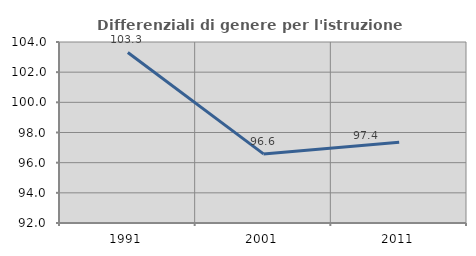
| Category | Differenziali di genere per l'istruzione superiore |
|---|---|
| 1991.0 | 103.307 |
| 2001.0 | 96.58 |
| 2011.0 | 97.356 |